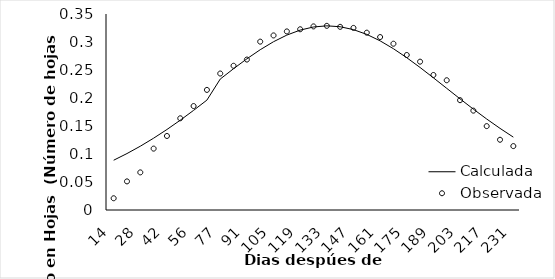
| Category | Calculada | Observada |
|---|---|---|
| 14.0 | 0.089 | 0.021 |
| 21.0 | 0.101 | 0.051 |
| 28.0 | 0.114 | 0.067 |
| 35.0 | 0.128 | 0.11 |
| 42.0 | 0.144 | 0.132 |
| 49.0 | 0.16 | 0.164 |
| 56.0 | 0.178 | 0.186 |
| 63.0 | 0.196 | 0.214 |
| 77.0 | 0.234 | 0.244 |
| 84.0 | 0.252 | 0.258 |
| 91.0 | 0.27 | 0.269 |
| 98.0 | 0.286 | 0.301 |
| 105.0 | 0.301 | 0.312 |
| 112.0 | 0.312 | 0.319 |
| 119.0 | 0.321 | 0.323 |
| 126.0 | 0.327 | 0.328 |
| 133.0 | 0.329 | 0.329 |
| 140.0 | 0.327 | 0.327 |
| 147.0 | 0.322 | 0.325 |
| 154.0 | 0.314 | 0.317 |
| 161.0 | 0.302 | 0.309 |
| 168.0 | 0.288 | 0.297 |
| 175.0 | 0.272 | 0.277 |
| 182.0 | 0.254 | 0.265 |
| 189.0 | 0.236 | 0.241 |
| 196.0 | 0.217 | 0.232 |
| 203.0 | 0.198 | 0.196 |
| 210.0 | 0.18 | 0.177 |
| 217.0 | 0.162 | 0.15 |
| 224.0 | 0.146 | 0.125 |
| 231.0 | 0.13 | 0.114 |